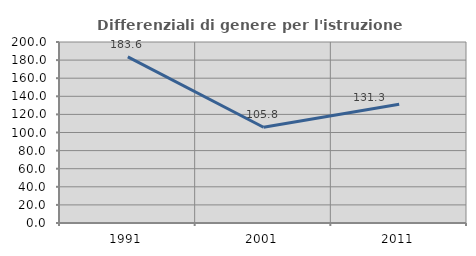
| Category | Differenziali di genere per l'istruzione superiore |
|---|---|
| 1991.0 | 183.6 |
| 2001.0 | 105.805 |
| 2011.0 | 131.263 |